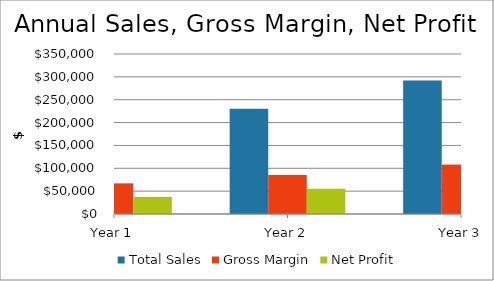
| Category | Total Sales | Gross Margin | Net Profit |
|---|---|---|---|
| Year 1 | 181165.062 | 67031.073 | 37441.16 |
| Year 2 | 230031.557 | 85111.676 | 55277.24 |
| Year 3 | 292079.038 | 108069.244 | 72663.994 |